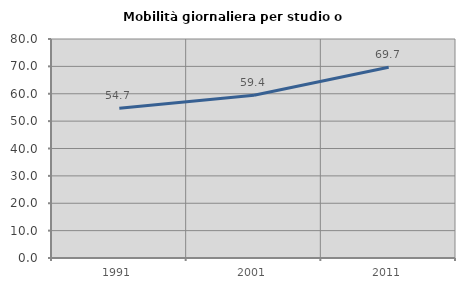
| Category | Mobilità giornaliera per studio o lavoro |
|---|---|
| 1991.0 | 54.693 |
| 2001.0 | 59.426 |
| 2011.0 | 69.654 |